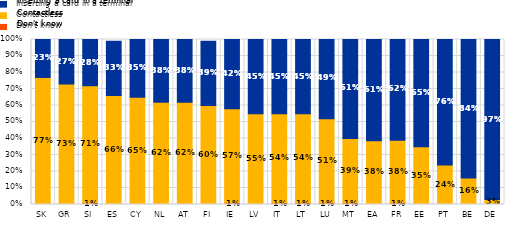
| Category | Don't know | Contactless | Inserting a card in a terminal |
|---|---|---|---|
| SK | 0 | 0.77 | 0.23 |
| GR | 0 | 0.73 | 0.27 |
| SI | 0.01 | 0.71 | 0.28 |
| ES | 0 | 0.66 | 0.33 |
| CY | 0 | 0.65 | 0.35 |
| NL | 0 | 0.62 | 0.38 |
| AT | 0 | 0.62 | 0.38 |
| FI | 0 | 0.6 | 0.39 |
| IE | 0.01 | 0.57 | 0.42 |
| LV | 0 | 0.55 | 0.45 |
| IT | 0.01 | 0.54 | 0.45 |
| LT | 0.01 | 0.54 | 0.45 |
| LU | 0.01 | 0.51 | 0.49 |
| MT | 0.01 | 0.39 | 0.61 |
| EA | 0.004 | 0.382 | 0.614 |
| FR | 0.01 | 0.38 | 0.62 |
| EE | 0 | 0.35 | 0.65 |
| PT | 0 | 0.24 | 0.76 |
| BE | 0 | 0.16 | 0.84 |
| DE | 0 | 0.03 | 0.97 |